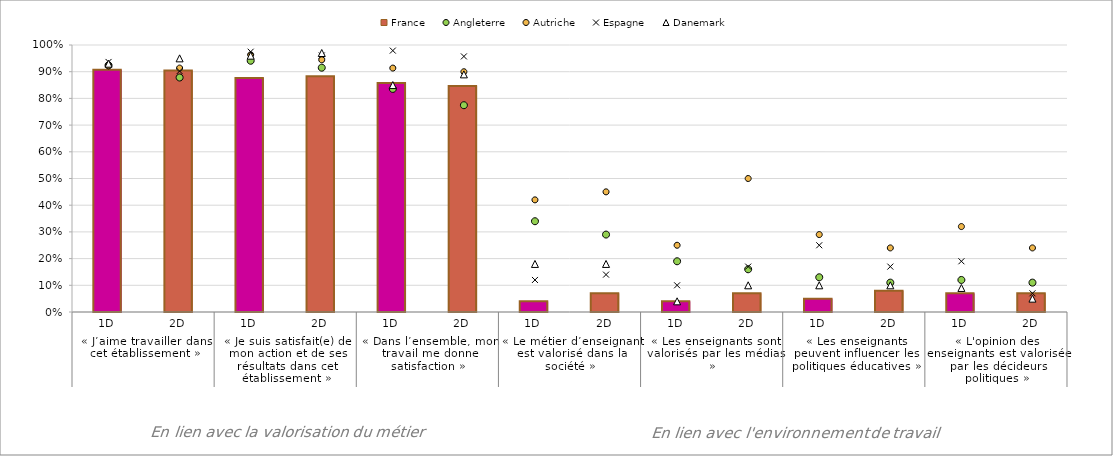
| Category | France |
|---|---|
| 0 | 0.907 |
| 1 | 0.904 |
| 2 | 0.877 |
| 3 | 0.883 |
| 4 | 0.857 |
| 5 | 0.847 |
| 6 | 0.04 |
| 7 | 0.07 |
| 8 | 0.04 |
| 9 | 0.07 |
| 10 | 0.05 |
| 11 | 0.08 |
| 12 | 0.07 |
| 13 | 0.07 |